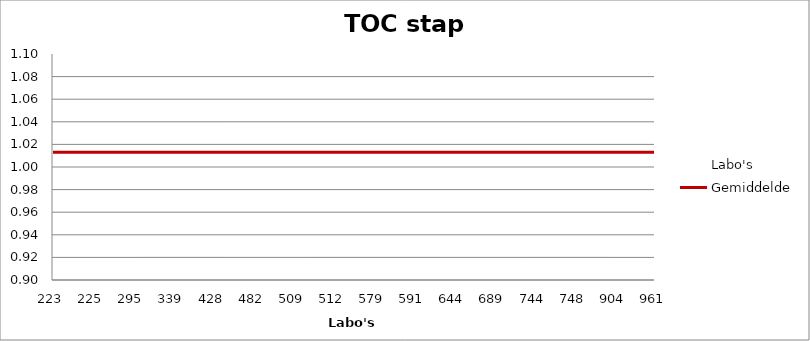
| Category | Labo's | Gemiddelde |
|---|---|---|
| 223.0 | 0.949 | 1.013 |
| 225.0 | 0.968 | 1.013 |
| 295.0 | 1.001 | 1.013 |
| 339.0 | 0.96 | 1.013 |
| 428.0 | 1.01 | 1.013 |
| 482.0 | 1.005 | 1.013 |
| 509.0 | 0.988 | 1.013 |
| 512.0 | 1.025 | 1.013 |
| 579.0 | 1.01 | 1.013 |
| 591.0 | 0.99 | 1.013 |
| 644.0 | 1.056 | 1.013 |
| 689.0 | 1.012 | 1.013 |
| 744.0 | 1.06 | 1.013 |
| 748.0 | 1.093 | 1.013 |
| 904.0 | 1.027 | 1.013 |
| 961.0 | 1.069 | 1.013 |